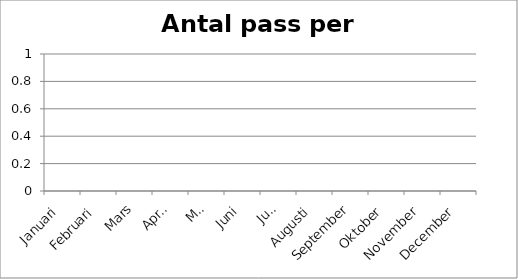
| Category | Antal pass per månad |
|---|---|
| Januari | 0 |
| Februari | 0 |
| Mars | 0 |
| April | 0 |
| Maj | 0 |
| Juni | 0 |
| Juli | 0 |
| Augusti | 0 |
| September | 0 |
| Oktober | 0 |
| November | 0 |
| December | 0 |